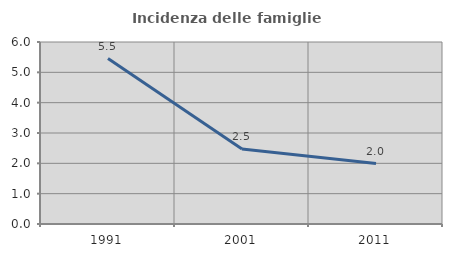
| Category | Incidenza delle famiglie numerose |
|---|---|
| 1991.0 | 5.453 |
| 2001.0 | 2.469 |
| 2011.0 | 1.991 |